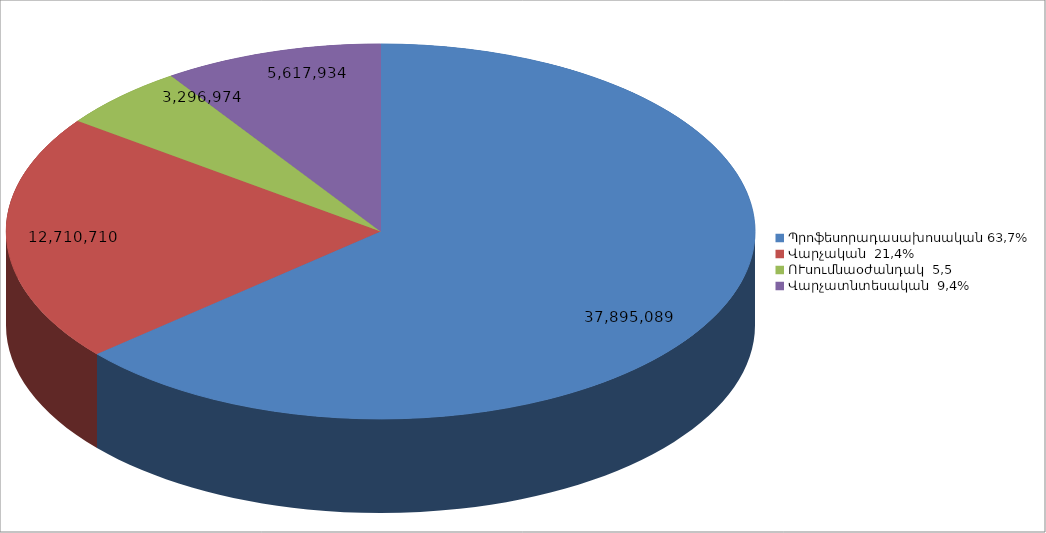
| Category | Series 0 |
|---|---|
| Պրոֆեսորադասախոսական 63,7% | 37895089 |
| Վարչական  21,4% | 12710710 |
| ՈՒսումնաօժանդակ  5,5 | 3296974 |
| Վարչատնտեսական  9,4% | 5617934 |